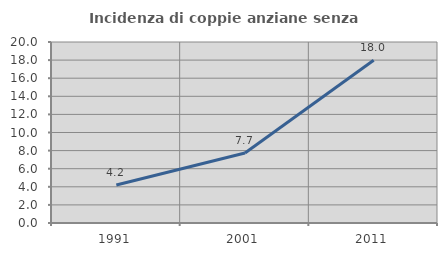
| Category | Incidenza di coppie anziane senza figli  |
|---|---|
| 1991.0 | 4.199 |
| 2001.0 | 7.731 |
| 2011.0 | 17.991 |